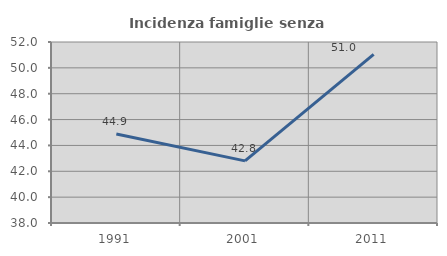
| Category | Incidenza famiglie senza nuclei |
|---|---|
| 1991.0 | 44.884 |
| 2001.0 | 42.807 |
| 2011.0 | 51.042 |